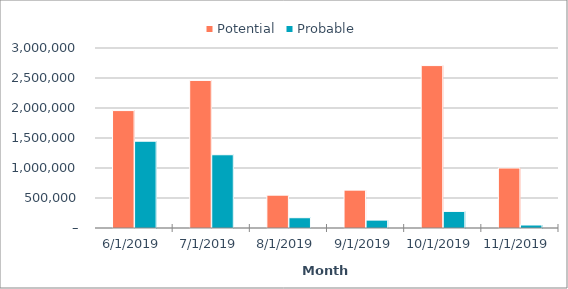
| Category | Potential | Probable |
|---|---|---|
| 11/30/19 | 1000000 | 50000 |
| 10/31/19 | 2707000 | 276400 |
| 9/30/19 | 631000 | 131650 |
| 8/31/19 | 547000 | 171300 |
| 7/31/19 | 2460000 | 1220600 |
| 6/30/19 | 1957000 | 1446600 |